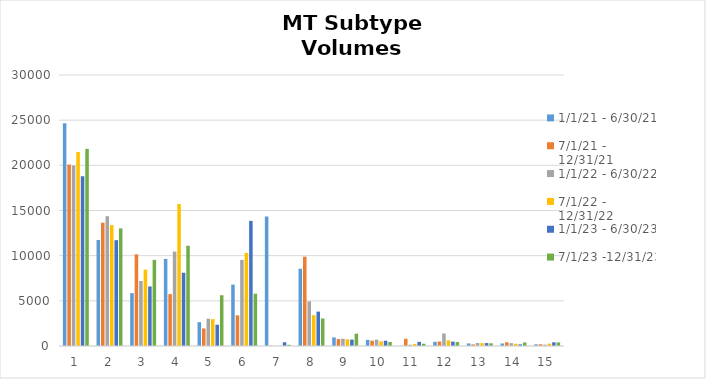
| Category | 1/1/21 - 6/30/21 | 7/1/21 - 12/31/21 | 1/1/22 - 6/30/22 | 7/1/22 - 12/31/22 | 1/1/23 - 6/30/23  | 7/1/23 -12/31/23  |
|---|---|---|---|---|---|---|
| 1 | 24670 | 20083 | 19974 | 21468 | 18791 | 21820 |
| 2 | 11732 | 13652 | 14376 | 13384 | 11716 | 13018 |
| 3 | 5852 | 10147 | 7194 | 8448 | 6594 | 9537 |
| 4 | 9641 | 5744 | 10454 | 15726 | 8110 | 11096 |
| 5 | 2638 | 1944 | 3021 | 2978 | 2354 | 5620 |
| 6 | 6796 | 3389 | 9531 | 10301 | 13853 | 5789 |
| 7 | 14333 | 25 | 5 | 14 | 415 | 132 |
| 8 | 8552 | 9888 | 4940 | 3413 | 3807 | 3043 |
| 9 | 949 | 763 | 803 | 741 | 708 | 1361 |
| 10 | 678 | 587 | 703 | 519 | 585 | 446 |
| 11 | 26 | 798 | 137 | 232 | 454 | 248 |
| 12 | 463 | 502 | 1387 | 627 | 486 | 435 |
| 13 | 283 | 177 | 331 | 317 | 322 | 300 |
| 14 | 282 | 411 | 314 | 250 | 180 | 390 |
| 15 | 181 | 193 | 150 | 259 | 409 | 393 |